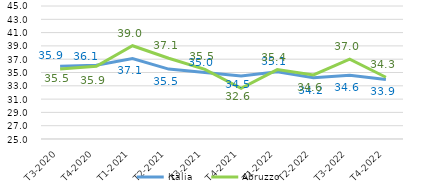
| Category | Italia | Abruzzo |
|---|---|---|
|   T3-2020 | 35.938 | 35.527 |
|   T4-2020 | 36.104 | 35.935 |
|   T1-2021 | 37.107 | 39.023 |
|   T2-2021 | 35.509 | 37.138 |
|   T3-2021 | 34.983 | 35.478 |
|   T4-2021 | 34.464 | 32.62 |
|   T1-2022 | 35.127 | 35.444 |
|   T2-2022 | 34.205 | 34.625 |
|   T3-2022 | 34.586 | 37.024 |
|   T4-2022 | 33.949 | 34.286 |